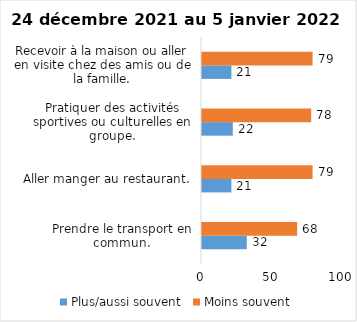
| Category | Plus/aussi souvent | Moins souvent |
|---|---|---|
| Prendre le transport en commun. | 32 | 68 |
| Aller manger au restaurant. | 21 | 79 |
| Pratiquer des activités sportives ou culturelles en groupe. | 22 | 78 |
| Recevoir à la maison ou aller en visite chez des amis ou de la famille. | 21 | 79 |